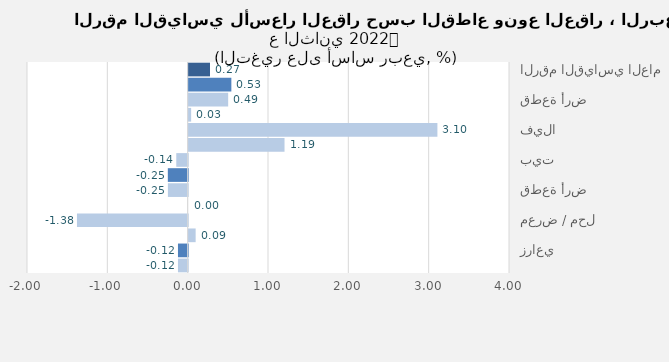
| Category | Series 0 |
|---|---|
| الرقم القياسي العام | 0.266 |
| سكني | 0.531 |
| قطعة أرض | 0.492 |
| عمارة | 0.031 |
| فيلا | 3.096 |
| شقة | 1.193 |
| بيت | -0.142 |
| تجاري | -0.247 |
| قطعة أرض | -0.246 |
| عمارة | 0 |
| معرض / محل | -1.378 |
| مركز تجاري | 0.087 |
| زراعي | -0.121 |
| أرض زراعية | -0.121 |